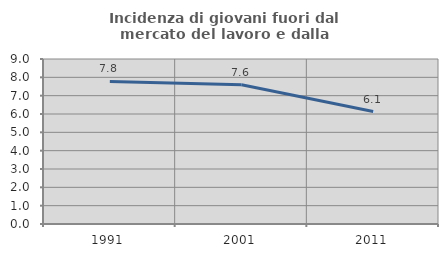
| Category | Incidenza di giovani fuori dal mercato del lavoro e dalla formazione  |
|---|---|
| 1991.0 | 7.774 |
| 2001.0 | 7.595 |
| 2011.0 | 6.135 |